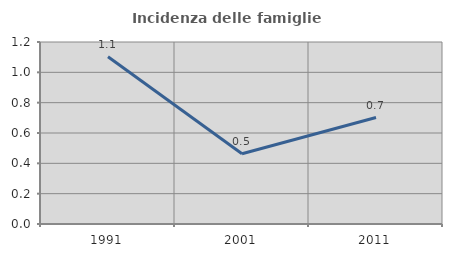
| Category | Incidenza delle famiglie numerose |
|---|---|
| 1991.0 | 1.103 |
| 2001.0 | 0.463 |
| 2011.0 | 0.702 |